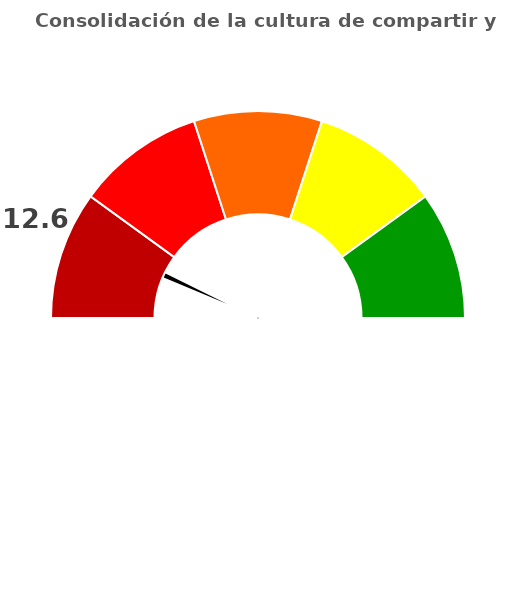
| Category | refe |
|---|---|
| 0 | 12.6 |
| 1 | 2 |
| 2 | 185.4 |